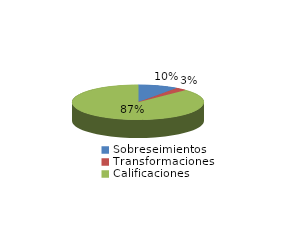
| Category | Series 0 |
|---|---|
| Sobreseimientos | 38 |
| Transformaciones | 11 |
| Calificaciones | 339 |